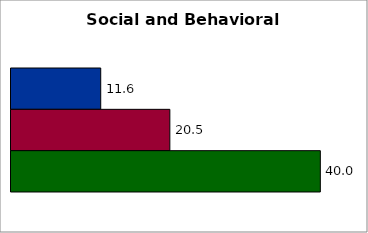
| Category | 50 states and D.C. | SREB states | State |
|---|---|---|---|
| 0 | 11.602 | 20.541 | 40 |